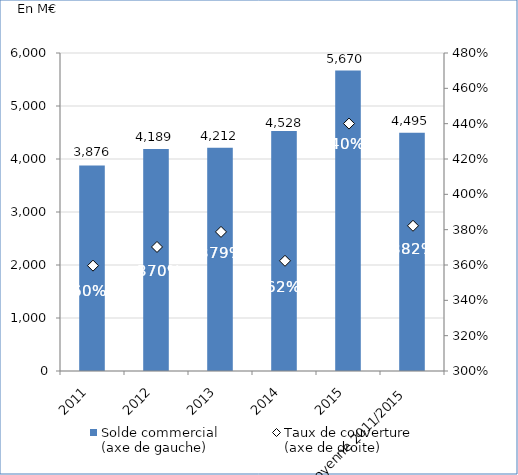
| Category | Solde commercial 
(axe de gauche) |
|---|---|
| 2011 | 3875.873 |
| 2012 | 4189.282 |
| 2013 | 4211.844 |
| 2014 | 4528.253 |
| 2015 | 5670.127 |
| Moyenne 2011/2015 | 4495.076 |